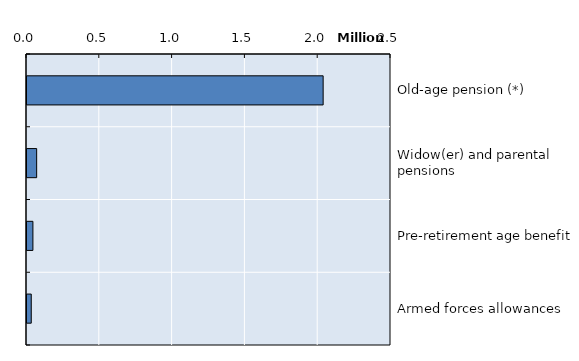
| Category | Series 0 |
|---|---|
| Old-age pension (*) | 2033985 |
| Widow(er) and parental pensions | 66363 |
| Pre-retirement age benefit | 40637 |
| Armed forces allowances | 29210 |